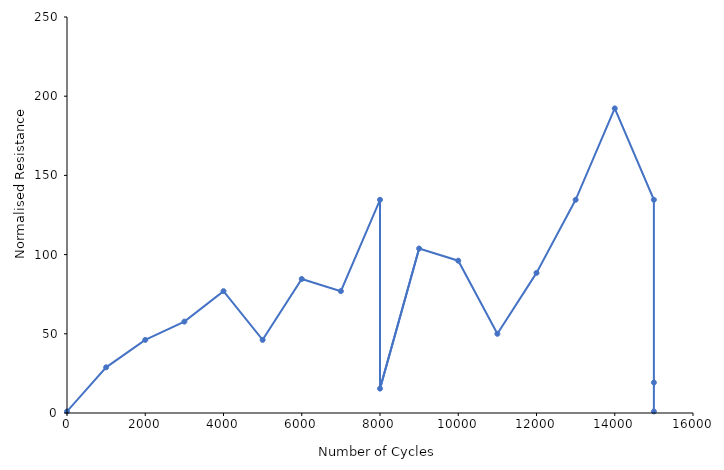
| Category | Normalised Resistance |
|---|---|
| 0.0 | 1 |
| 1000.0 | 28.846 |
| 2000.0 | 46.154 |
| 3000.0 | 57.692 |
| 4000.0 | 76.923 |
| 5000.0 | 46.154 |
| 6000.0 | 84.615 |
| 7000.0 | 76.923 |
| 8000.0 | 134.615 |
| 8000.0 | 15.385 |
| 9000.0 | 103.846 |
| 10000.0 | 96.154 |
| 11000.0 | 50 |
| 12000.0 | 88.462 |
| 13000.0 | 134.615 |
| 14000.0 | 192.308 |
| 15000.0 | 134.615 |
| 15000.0 | 19.231 |
| 15000.0 | 1 |